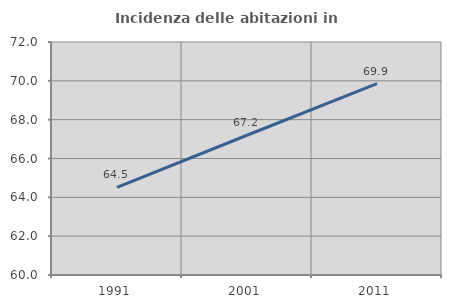
| Category | Incidenza delle abitazioni in proprietà  |
|---|---|
| 1991.0 | 64.516 |
| 2001.0 | 67.198 |
| 2011.0 | 69.854 |